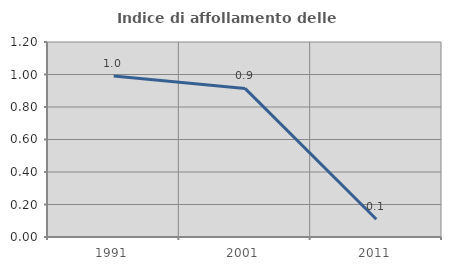
| Category | Indice di affollamento delle abitazioni  |
|---|---|
| 1991.0 | 0.99 |
| 2001.0 | 0.914 |
| 2011.0 | 0.109 |